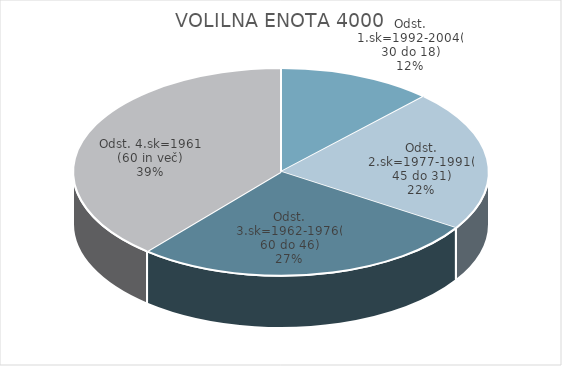
| Category | VOLILNA ENOTA 4000 |
|---|---|
| Odst. 1.sk=1992-2004(30 do 18) | 6.69 |
| Odst. 2.sk=1977-1991(45 do 31) | 12.24 |
| Odst. 3.sk=1962-1976(60 do 46) | 15 |
| Odst. 4.sk=1961 (60 in več) | 21.57 |